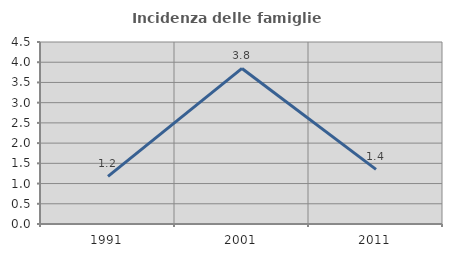
| Category | Incidenza delle famiglie numerose |
|---|---|
| 1991.0 | 1.176 |
| 2001.0 | 3.846 |
| 2011.0 | 1.351 |